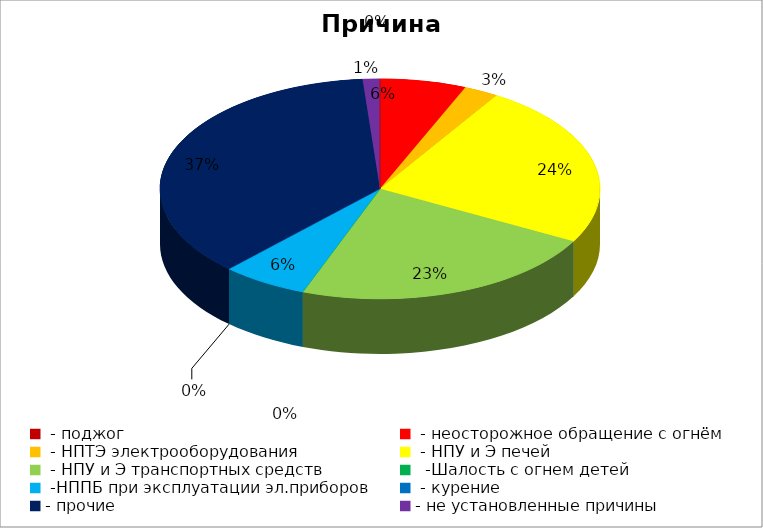
| Category | Причина пожара |
|---|---|
|  - поджог | 0 |
|  - неосторожное обращение с огнём | 5 |
|  - НПТЭ электрооборудования | 2 |
|  - НПУ и Э печей | 19 |
|  - НПУ и Э транспортных средств | 18 |
|   -Шалость с огнем детей | 0 |
|  -НППБ при эксплуатации эл.приборов | 5 |
|  - курение | 0 |
| - прочие | 29 |
| - не установленные причины | 1 |